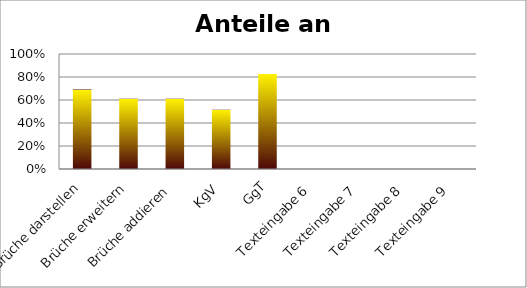
| Category | Series 0 |
|---|---|
| Brüche darstellen | 0.69 |
| Brüche erweitern | 0.611 |
| Brüche addieren | 0.611 |
| KgV | 0.516 |
| GgT | 0.825 |
| Texteingabe 6 | 0 |
| Texteingabe 7 | 0 |
| Texteingabe 8 | 0 |
| Texteingabe 9 | 0 |